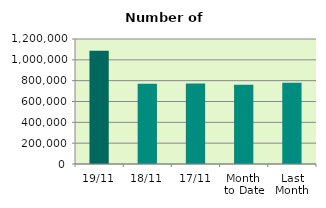
| Category | Series 0 |
|---|---|
| 19/11 | 1086076 |
| 18/11 | 769914 |
| 17/11 | 773460 |
| Month 
to Date | 760709.333 |
| Last
Month | 780428.952 |